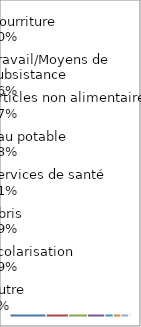
| Category | Series 0 |
|---|---|
| Oui | 0.399 |
| Non | 0.601 |